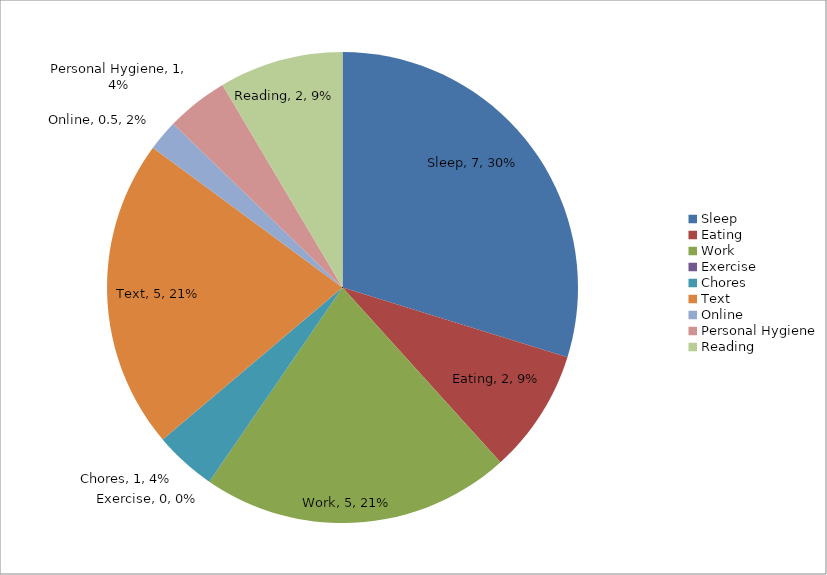
| Category | Series 0 |
|---|---|
| Sleep | 7 |
| Eating | 2 |
| Work | 5 |
| Exercise | 0 |
| Chores | 1 |
| Text | 5 |
| Online | 0.5 |
| Personal Hygiene | 1 |
| Reading | 2 |